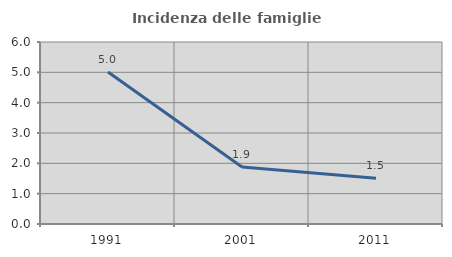
| Category | Incidenza delle famiglie numerose |
|---|---|
| 1991.0 | 5.009 |
| 2001.0 | 1.878 |
| 2011.0 | 1.511 |